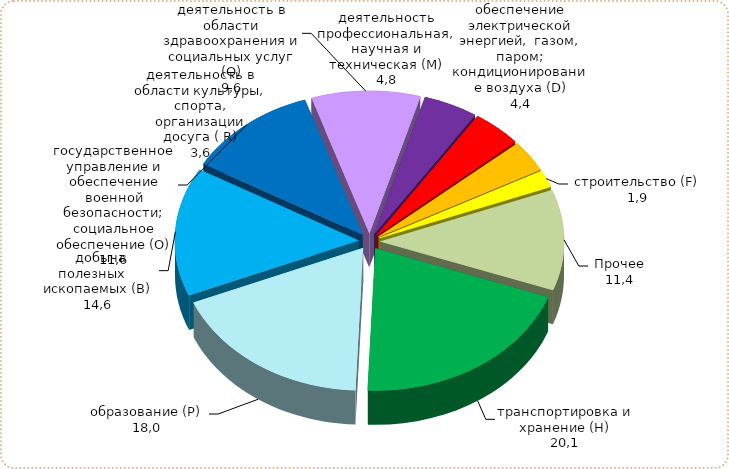
| Category | Series 3 | Series 2 | Series 1 | Series 0 |
|---|---|---|---|---|
| транспортировка и хранение (H) | 20.111 | 0 | 0 | 0 |
| образование (Р) | 18.048 | 0 | 0 | 0 |
|     добыча   полезных    ископаемых (В) | 14.6 | 0 | 0 | 0 |
| государственное управление и обеспечение военной безопасности; социальное обеспечение (О) | 11.578 | 0 | 0 | 0 |
| деятельность в области здравоохранения и социальных услуг (Q) | 9.568 | 0 | 0 | 0 |
| деятельность профессиональная, научная и техническая (М) | 4.773 | 0 | 0 | 0 |
| обеспечение электрической энергией,  газом, паром; кондиционирование воздуха (D) | 4.354 | 0 | 0 | 0 |
| деятельность в области культуры, спорта, организации досуга ( R) | 3.578 | 0 | 0 | 0 |
| строительство (F) | 1.941 | 0 | 0 | 0 |
| Прочее | 11.433 | 0 | 0 | 0 |